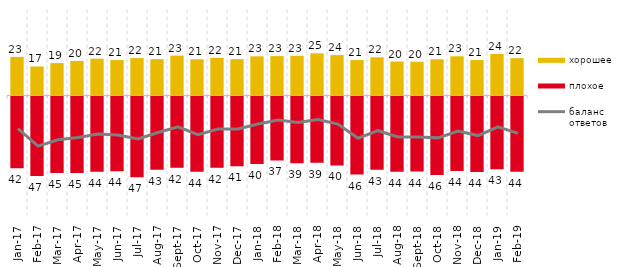
| Category | хорошее | плохое |
|---|---|---|
| 2017-01-01 | 22.55 | -42 |
| 2017-02-01 | 16.95 | -46.6 |
| 2017-03-01 | 18.95 | -44.9 |
| 2017-04-01 | 20.2 | -44.85 |
| 2017-05-01 | 21.5 | -44.1 |
| 2017-06-01 | 20.7 | -43.85 |
| 2017-07-01 | 21.85 | -47.35 |
| 2017-08-01 | 21.25 | -42.95 |
| 2017-09-01 | 23.3 | -41.7 |
| 2017-10-01 | 21.15 | -44.15 |
| 2017-11-01 | 22 | -41.7 |
| 2017-12-01 | 21.25 | -40.95 |
| 2018-01-01 | 22.9 | -39.6 |
| 2018-02-01 | 23 | -37.45 |
| 2018-03-01 | 23.2 | -39.1 |
| 2018-04-01 | 24.65 | -38.8 |
| 2018-05-01 | 23.6 | -40.4 |
| 2018-06-01 | 20.7 | -45.75 |
| 2018-07-01 | 22.3 | -42.95 |
| 2018-08-01 | 19.85 | -44.15 |
| 2018-09-01 | 19.7 | -44 |
| 2018-10-01 | 21.15 | -46 |
| 2018-11-01 | 22.904 | -43.713 |
| 2018-12-01 | 20.7 | -44.2 |
| 2019-01-01 | 24.25 | -42.65 |
| 2019-02-01 | 21.8 | -44.05 |